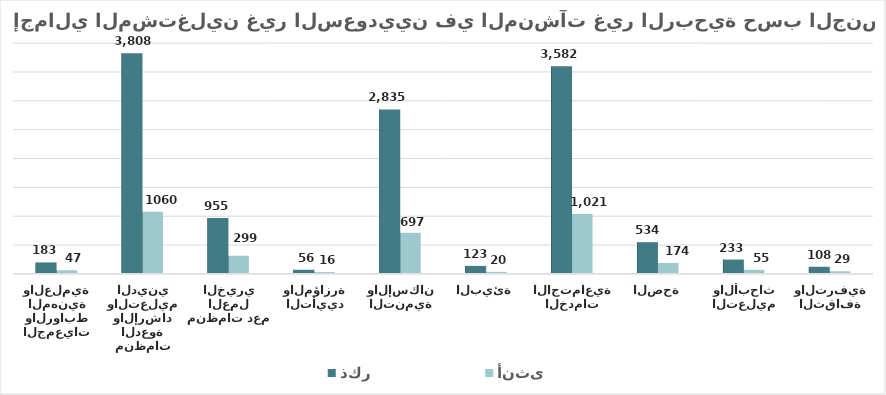
| Category | ذكر | أنثى |
|---|---|---|
| الثقافة والترفية | 108 | 29 |
| التعليم والأبحاث | 233 | 55 |
| الصحة | 534 | 174 |
| الخدمات الاجتماعية | 3582 | 1021 |
| البيئة | 123 | 20 |
| التنمية والإسكان | 2835 | 697 |
| التأييد والمؤازرة | 56 | 16 |
| منظمات دعم العمل الخيري | 955 | 299 |
| منظمات الدعوة والإرشاد والتعليم الديني | 3808 | 1060 |
| الجمعيات والروابط المهنية والعلمية | 183 | 47 |